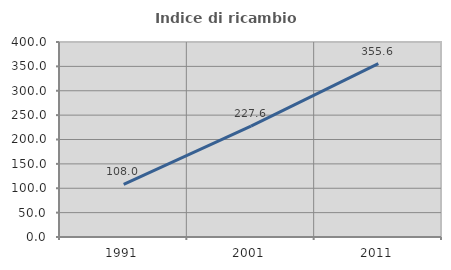
| Category | Indice di ricambio occupazionale  |
|---|---|
| 1991.0 | 107.955 |
| 2001.0 | 227.586 |
| 2011.0 | 355.556 |